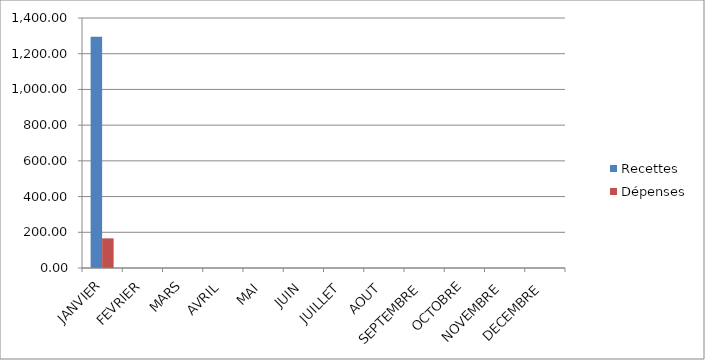
| Category | Recettes | Dépenses |
|---|---|---|
| JANVIER | 1295 | 166 |
| FEVRIER | 0 | 0 |
| MARS | 0 | 0 |
| AVRIL | 0 | 0 |
| MAI | 0 | 0 |
| JUIN | 0 | 0 |
| JUILLET | 0 | 0 |
| AOUT | 0 | 0 |
| SEPTEMBRE | 0 | 0 |
| OCTOBRE | 0 | 0 |
| NOVEMBRE | 0 | 0 |
| DECEMBRE | 0 | 0 |